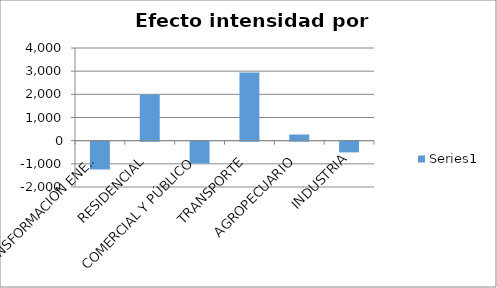
| Category | Series 0 |
|---|---|
| TRANSFORMACIÓN ENERGÍA | -1200.397 |
| RESIDENCIAL | 1990.608 |
| COMERCIAL Y PÚBLICO | -938.788 |
| TRANSPORTE | 2946.47 |
| AGROPECUARIO | 265.539 |
| INDUSTRIA | -462.6 |